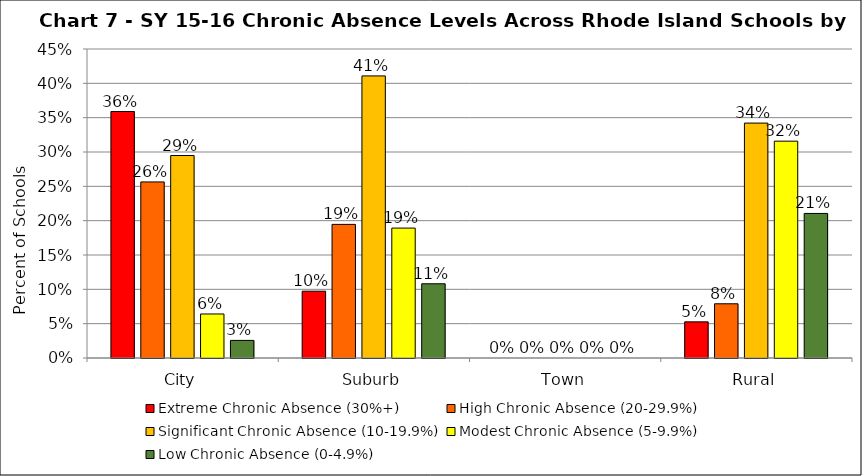
| Category | Extreme Chronic Absence (30%+) | High Chronic Absence (20-29.9%) | Significant Chronic Absence (10-19.9%) | Modest Chronic Absence (5-9.9%) | Low Chronic Absence (0-4.9%) |
|---|---|---|---|---|---|
| 0 | 0.359 | 0.256 | 0.295 | 0.064 | 0.026 |
| 1 | 0.097 | 0.195 | 0.411 | 0.189 | 0.108 |
| 2 | 0 | 0 | 0 | 0 | 0 |
| 3 | 0.053 | 0.079 | 0.342 | 0.316 | 0.211 |